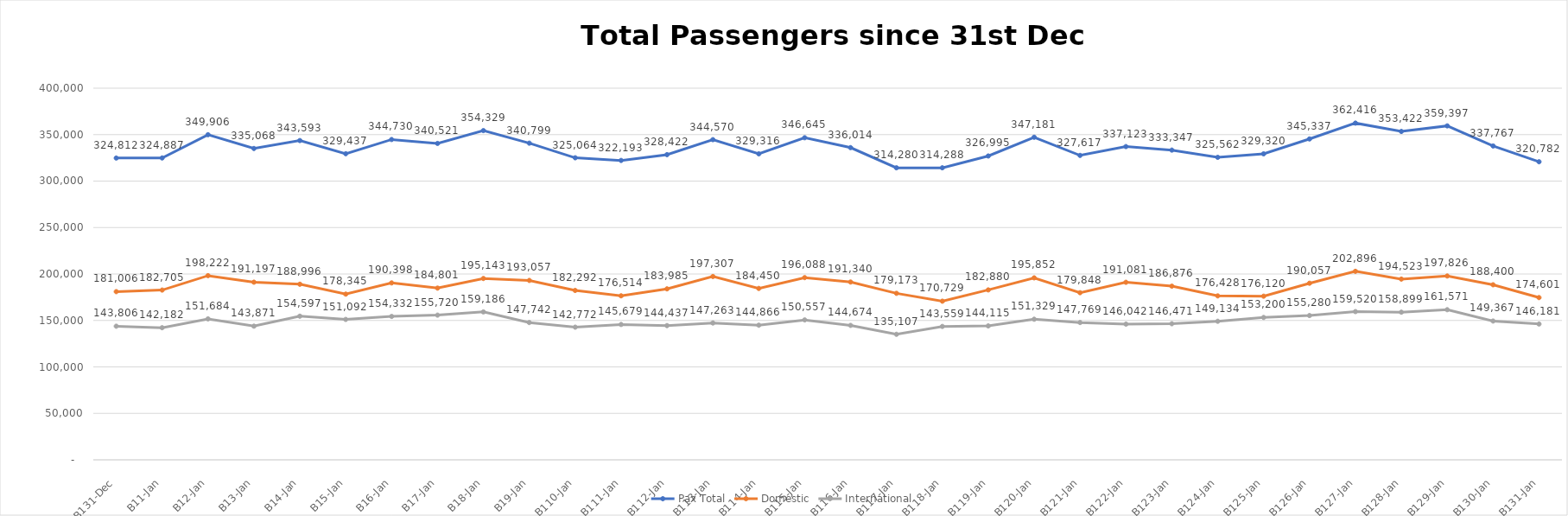
| Category | Pax Total |  Domestic  |  International  |
|---|---|---|---|
| 2022-12-31 | 324812 | 181006 | 143806 |
| 2023-01-01 | 324887 | 182705 | 142182 |
| 2023-01-02 | 349906 | 198222 | 151684 |
| 2023-01-03 | 335068 | 191197 | 143871 |
| 2023-01-04 | 343593 | 188996 | 154597 |
| 2023-01-05 | 329437 | 178345 | 151092 |
| 2023-01-06 | 344730 | 190398 | 154332 |
| 2023-01-07 | 340521 | 184801 | 155720 |
| 2023-01-08 | 354329 | 195143 | 159186 |
| 2023-01-09 | 340799 | 193057 | 147742 |
| 2023-01-10 | 325064 | 182292 | 142772 |
| 2023-01-11 | 322193 | 176514 | 145679 |
| 2023-01-12 | 328422 | 183985 | 144437 |
| 2023-01-13 | 344570 | 197307 | 147263 |
| 2023-01-14 | 329316 | 184450 | 144866 |
| 2023-01-15 | 346645 | 196088 | 150557 |
| 2023-01-16 | 336014 | 191340 | 144674 |
| 2023-01-17 | 314280 | 179173 | 135107 |
| 2023-01-18 | 314288 | 170729 | 143559 |
| 2023-01-19 | 326995 | 182880 | 144115 |
| 2023-01-20 | 347181 | 195852 | 151329 |
| 2023-01-21 | 327617 | 179848 | 147769 |
| 2023-01-22 | 337123 | 191081 | 146042 |
| 2023-01-23 | 333347 | 186876 | 146471 |
| 2023-01-24 | 325562 | 176428 | 149134 |
| 2023-01-25 | 329320 | 176120 | 153200 |
| 2023-01-26 | 345337 | 190057 | 155280 |
| 2023-01-27 | 362416 | 202896 | 159520 |
| 2023-01-28 | 353422 | 194523 | 158899 |
| 2023-01-29 | 359397 | 197826 | 161571 |
| 2023-01-30 | 337767 | 188400 | 149367 |
| 2023-01-31 | 320782 | 174601 | 146181 |